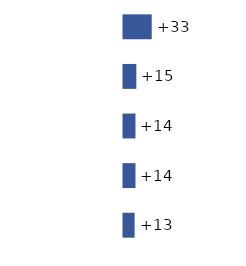
| Category | Series 0 |
|---|---|
| 0 | 33 |
| 1 | 15 |
| 2 | 14 |
| 3 | 14 |
| 4 | 13 |